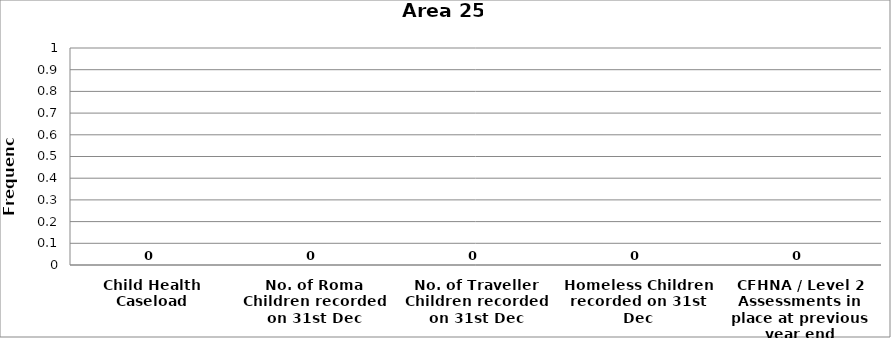
| Category | Area 25 |
|---|---|
| Child Health Caseload | 0 |
| No. of Roma Children recorded on 31st Dec | 0 |
| No. of Traveller Children recorded on 31st Dec | 0 |
| Homeless Children recorded on 31st Dec | 0 |
| CFHNA / Level 2 Assessments in place at previous year end | 0 |